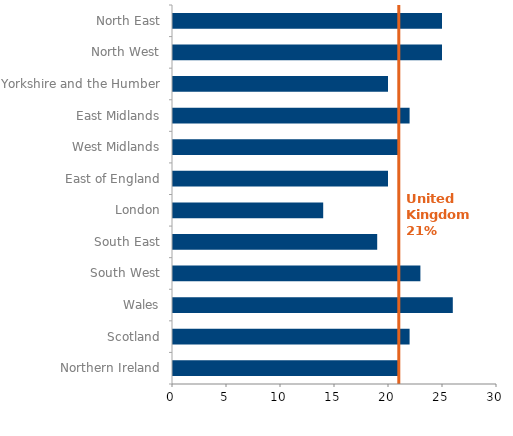
| Category | Percentage of people |
|---|---|
| Northern Ireland | 21 |
| Scotland | 22 |
| Wales | 26 |
| South West | 23 |
| South East | 19 |
| London | 14 |
| East of England | 20 |
| West Midlands | 21 |
| East Midlands | 22 |
| Yorkshire and the Humber | 20 |
| North West | 25 |
| North East | 25 |